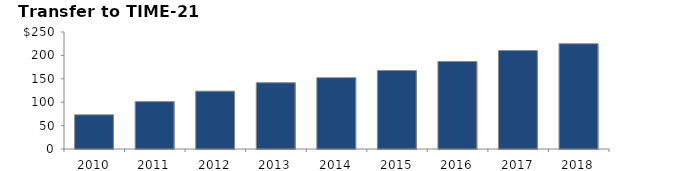
| Category | Fees for New Reg. |
|---|---|
| 2010.0 | 73.066 |
| 2011.0 | 101.254 |
| 2012.0 | 123.622 |
| 2013.0 | 141.627 |
| 2014.0 | 152.359 |
| 2015.0 | 167.654 |
| 2016.0 | 187 |
| 2017.0 | 210.4 |
| 2018.0 | 224.9 |